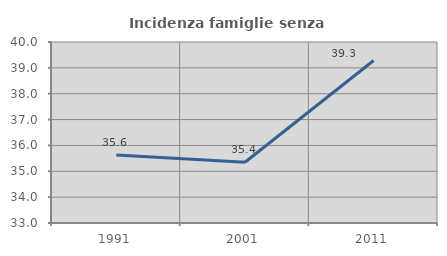
| Category | Incidenza famiglie senza nuclei |
|---|---|
| 1991.0 | 35.629 |
| 2001.0 | 35.35 |
| 2011.0 | 39.286 |